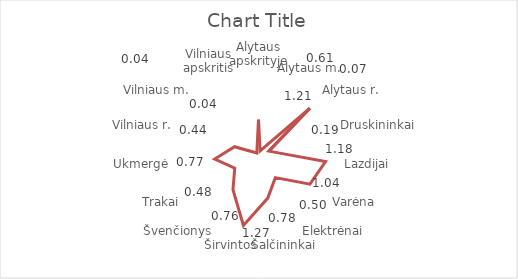
| Category | Series 0 |
|---|---|
| Alytaus apskrityje | 0.61 |
| Alytaus m. | 0.07 |
| Alytaus r. | 1.21 |
| Druskininkai | 0.19 |
| Lazdijai | 1.18 |
| Varėna | 1.04 |
| Elektrėnai | 0.5 |
| Šalčininkai | 0.78 |
| Širvintos | 1.27 |
| Švenčionys | 0.76 |
| Trakai | 0.48 |
| Ukmergė | 0.77 |
| Vilniaus r. | 0.44 |
| Vilniaus m. | 0.04 |
| Vilniaus apskritis | 0.04 |